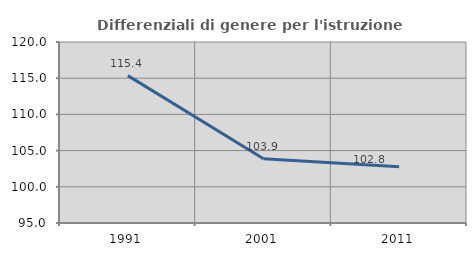
| Category | Differenziali di genere per l'istruzione superiore |
|---|---|
| 1991.0 | 115.353 |
| 2001.0 | 103.873 |
| 2011.0 | 102.769 |